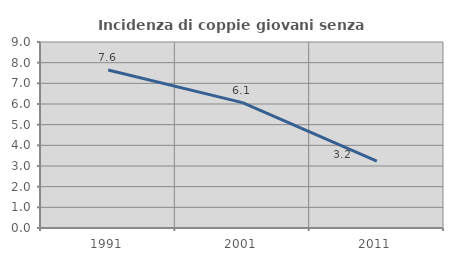
| Category | Incidenza di coppie giovani senza figli |
|---|---|
| 1991.0 | 7.644 |
| 2001.0 | 6.066 |
| 2011.0 | 3.234 |